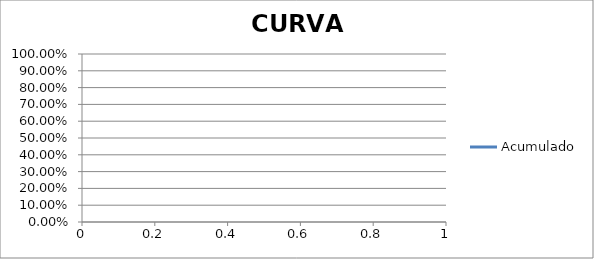
| Category | Acumulado |
|---|---|
| 0 | 0 |
| 1 | 0 |
| 2 | 0 |
| 3 | 0 |
| 4 | 0 |
| 5 | 0 |
| 6 | 0 |
| 7 | 0 |
| 8 | 0 |
| 9 | 0 |
| 10 | 0 |
| 11 | 0 |
| 12 | 0 |